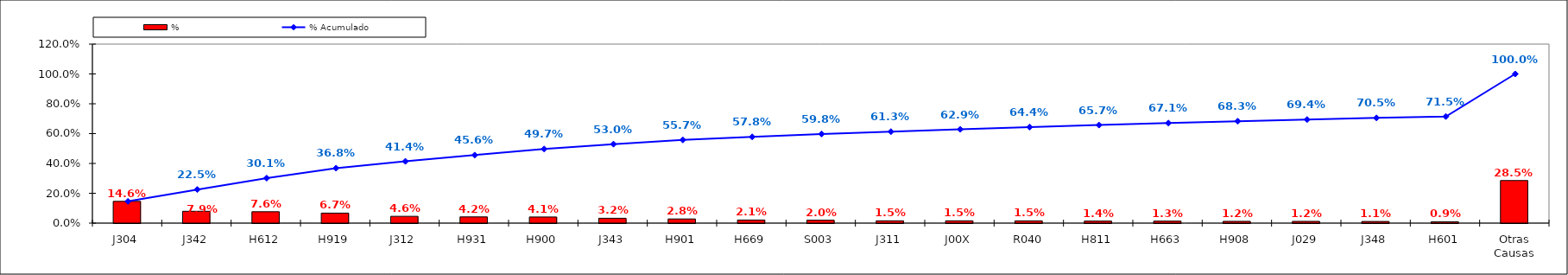
| Category | % |
|---|---|
| J304 | 0.146 |
| J342 | 0.079 |
| H612 | 0.076 |
| H919 | 0.067 |
| J312 | 0.046 |
| H931 | 0.042 |
| H900 | 0.041 |
| J343 | 0.032 |
| H901 | 0.028 |
| H669 | 0.021 |
| S003 | 0.02 |
| J311 | 0.015 |
| J00X | 0.015 |
| R040 | 0.015 |
| H811 | 0.014 |
| H663 | 0.013 |
| H908 | 0.012 |
| J029 | 0.012 |
| J348 | 0.011 |
| H601 | 0.009 |
| Otras Causas | 0.285 |